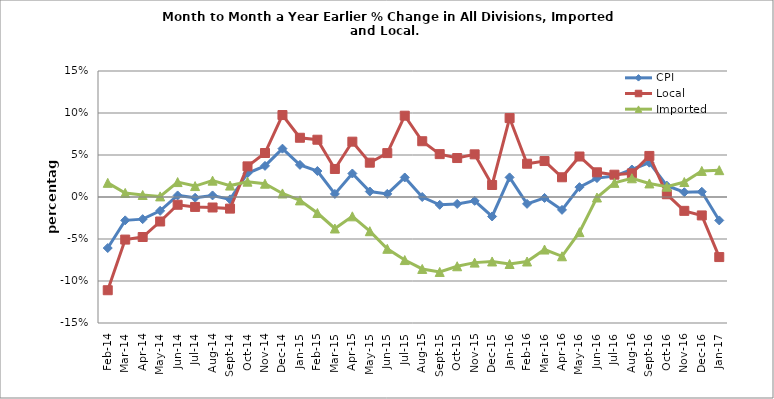
| Category | CPI | Local | Imported |
|---|---|---|---|
| 2014-02-02 | -0.061 | -0.111 | 0.017 |
| 2014-03-02 | -0.028 | -0.051 | 0.005 |
| 2014-04-02 | -0.026 | -0.048 | 0.002 |
| 2014-05-02 | -0.016 | -0.029 | 0.001 |
| 2014-06-02 | 0.002 | -0.009 | 0.018 |
| 2014-07-02 | -0.001 | -0.012 | 0.013 |
| 2014-08-02 | 0.002 | -0.012 | 0.019 |
| 2014-09-02 | -0.003 | -0.014 | 0.014 |
| 2014-10-02 | 0.028 | 0.036 | 0.018 |
| 2014-11-02 | 0.037 | 0.052 | 0.016 |
| 2014-12-02 | 0.058 | 0.098 | 0.004 |
| 2015-01-02 | 0.038 | 0.071 | -0.004 |
| 2015-02-02 | 0.031 | 0.068 | -0.019 |
| 2015-03-02 | 0.004 | 0.033 | -0.037 |
| 2015-04-02 | 0.028 | 0.066 | -0.023 |
| 2015-05-01 | 0.007 | 0.041 | -0.041 |
| 2015-06-01 | 0.004 | 0.052 | -0.062 |
| 2015-07-01 | 0.023 | 0.097 | -0.075 |
| 2015-08-01 | 0 | 0.066 | -0.086 |
| 2015-09-01 | -0.009 | 0.051 | -0.089 |
| 2015-10-01 | -0.008 | 0.046 | -0.082 |
| 2015-11-01 | -0.005 | 0.051 | -0.078 |
| 2015-12-01 | -0.023 | 0.014 | -0.077 |
| 2016-01-01 | 0.023 | 0.094 | -0.08 |
| 2016-02-01 | -0.008 | 0.04 | -0.077 |
| 2016-03-01 | -0.001 | 0.043 | -0.063 |
| 2016-04-01 | -0.015 | 0.023 | -0.071 |
| 2016-05-01 | 0.012 | 0.048 | -0.042 |
| 2016-06-01 | 0.023 | 0.029 | -0.001 |
| 2016-07-01 | 0.025 | 0.027 | 0.017 |
| 2016-08-01 | 0.033 | 0.028 | 0.022 |
| 2016-09-01 | 0.041 | 0.049 | 0.016 |
| 2016-10-01 | 0.014 | 0.003 | 0.012 |
| 2016-11-01 | 0.006 | -0.016 | 0.018 |
| 2016-12-01 | 0.006 | -0.022 | 0.031 |
| 2017-01-01 | -0.028 | -0.072 | 0.032 |